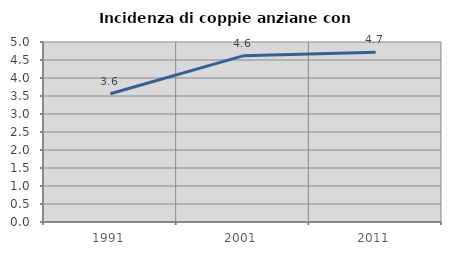
| Category | Incidenza di coppie anziane con figli |
|---|---|
| 1991.0 | 3.561 |
| 2001.0 | 4.615 |
| 2011.0 | 4.717 |